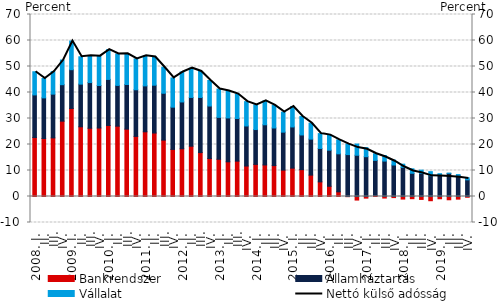
| Category | Bankrendszer | Államháztartás | Vállalat |
|---|---|---|---|
| 2008. I. | 22.687 | 16.383 | 8.905 |
|          II. | 22.302 | 15.632 | 7.464 |
|          III. | 22.546 | 16.826 | 8.669 |
|          IV. | 28.975 | 14.03 | 9.491 |
| 2009. I. | 33.864 | 14.909 | 11.025 |
|          II. | 26.811 | 16.412 | 10.515 |
|          III. | 26.251 | 17.578 | 10.348 |
|          IV. | 26.341 | 16.359 | 11.274 |
| 2010. I. | 27.323 | 17.709 | 11.434 |
|          II. | 27.05 | 15.677 | 12.099 |
|          III. | 25.913 | 17.174 | 11.79 |
|          IV. | 23.117 | 17.938 | 11.88 |
| 2011. I. | 24.887 | 17.66 | 11.548 |
|          II. | 24.412 | 18.395 | 10.845 |
|          III. | 21.689 | 18.018 | 10.013 |
|          IV. | 18.104 | 16.258 | 11.245 |
| 2012. I. | 18.362 | 18.001 | 11.53 |
|          II. | 19.341 | 18.758 | 11.252 |
|          III. | 16.894 | 21.196 | 10.013 |
|          IV. | 14.629 | 20.171 | 9.826 |
| 2013. I. | 14.328 | 16.11 | 10.887 |
| II. | 13.34 | 16.882 | 10.367 |
|          III. | 13.602 | 16.389 | 9.401 |
| IV. | 11.723 | 15.4 | 9.37 |
| 2014. I. | 12.351 | 13.401 | 9.502 |
| II. | 12.137 | 15.448 | 9.187 |
| III. | 11.891 | 14.465 | 8.697 |
| IV. | 10.149 | 14.601 | 7.703 |
| 2015. I. | 10.906 | 15.845 | 7.86 |
| II. | 10.329 | 13.34 | 7.084 |
| III. | 8.225 | 13.85 | 6.106 |
| IV. | 5.629 | 12.857 | 5.704 |
| 2016. I. | 3.932 | 13.888 | 5.793 |
| II. | 1.8 | 14.612 | 5.376 |
| III. | -0.068 | 16.116 | 4.089 |
| IV. | -1.368 | 15.868 | 4.316 |
| 2017. I. | -0.624 | 15.314 | 3.491 |
| II. | 0.346 | 13.558 | 2.536 |
| III. | -0.599 | 13.622 | 2.153 |
| IV. | -0.426 | 12.115 | 1.875 |
| 2018. I. | -0.991 | 11.193 | 1.242 |
| II. | -0.842 | 8.939 | 1.709 |
| III. | -1.124 | 8.903 | 1.228 |
| IV. | -1.622 | 8.007 | 1.552 |
| 2019. I. | -0.872 | 8.236 | 0.533 |
| II. | -1.257 | 8.898 | 0.063 |
| III. | -1.015 | 8.143 | 0.281 |
| IV. | -0.294 | 6.406 | 0.781 |